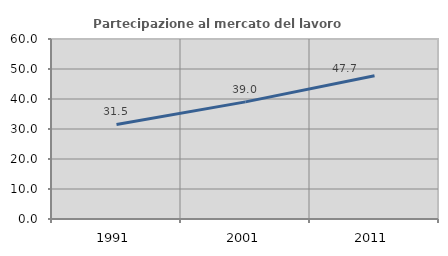
| Category | Partecipazione al mercato del lavoro  femminile |
|---|---|
| 1991.0 | 31.517 |
| 2001.0 | 39.049 |
| 2011.0 | 47.744 |